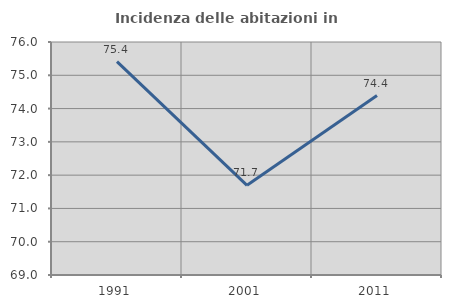
| Category | Incidenza delle abitazioni in proprietà  |
|---|---|
| 1991.0 | 75.41 |
| 2001.0 | 71.693 |
| 2011.0 | 74.39 |